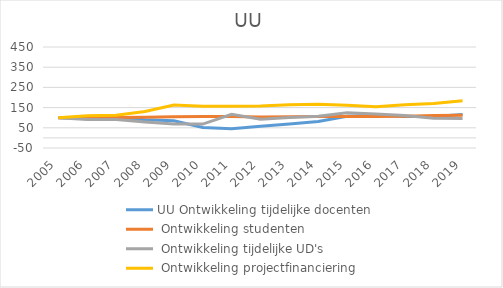
| Category | UU |
|---|---|
| 2005.0 | 100 |
| 2006.0 | 110.006 |
| 2007.0 | 111.742 |
| 2008.0 | 130.669 |
| 2009.0 | 162.641 |
| 2010.0 | 156.179 |
| 2011.0 | 157.088 |
| 2012.0 | 157.868 |
| 2013.0 | 164.535 |
| 2014.0 | 166.465 |
| 2015.0 | 161.775 |
| 2016.0 | 154.145 |
| 2017.0 | 163.959 |
| 2018.0 | 170.034 |
| 2019.0 | 183.909 |